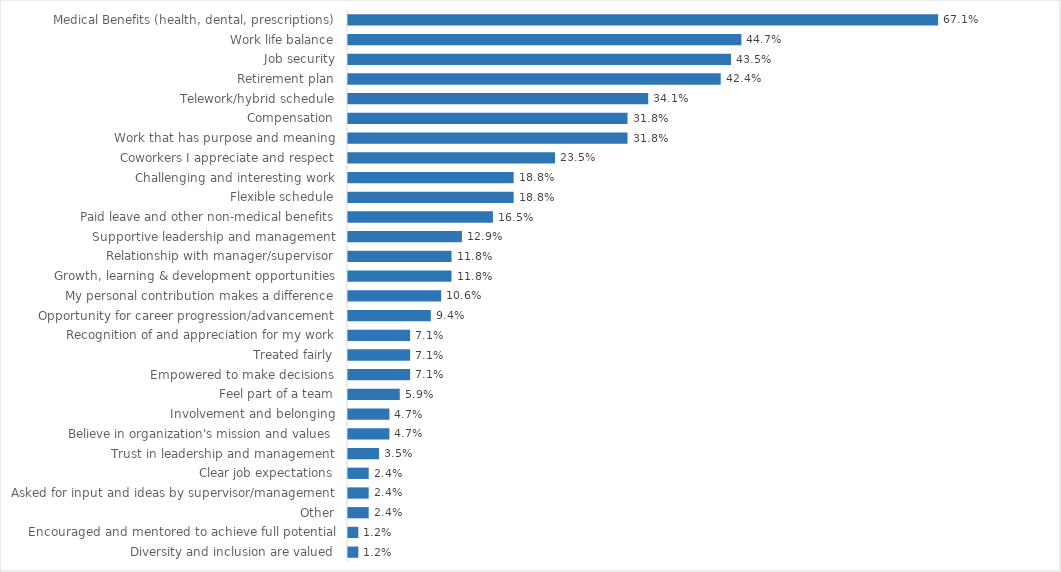
| Category | Agriculture, Food & Markets |
|---|---|
| Medical Benefits (health, dental, prescriptions) | 0.671 |
| Work life balance | 0.447 |
| Job security | 0.435 |
| Retirement plan | 0.424 |
| Telework/hybrid schedule | 0.341 |
| Compensation | 0.318 |
| Work that has purpose and meaning | 0.318 |
| Coworkers I appreciate and respect | 0.235 |
| Challenging and interesting work | 0.188 |
| Flexible schedule | 0.188 |
| Paid leave and other non-medical benefits | 0.165 |
| Supportive leadership and management | 0.129 |
| Relationship with manager/supervisor | 0.118 |
| Growth, learning & development opportunities | 0.118 |
| My personal contribution makes a difference | 0.106 |
| Opportunity for career progression/advancement | 0.094 |
| Recognition of and appreciation for my work | 0.071 |
| Treated fairly | 0.071 |
| Empowered to make decisions | 0.071 |
| Feel part of a team | 0.059 |
| Involvement and belonging | 0.047 |
| Believe in organization's mission and values | 0.047 |
| Trust in leadership and management | 0.035 |
| Clear job expectations | 0.024 |
| Asked for input and ideas by supervisor/management | 0.024 |
| Other | 0.024 |
| Encouraged and mentored to achieve full potential | 0.012 |
| Diversity and inclusion are valued | 0.012 |